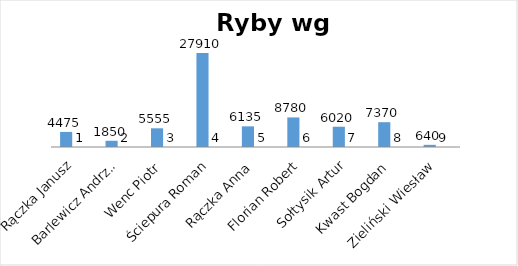
| Category | Series 0 | Series 1 |
|---|---|---|
| Rączka Janusz | 4475 | 1 |
| Barlewicz Andrzej | 1850 | 2 |
| Wenc Piotr | 5555 | 3 |
| Ściepura Roman | 27910 | 4 |
| Rączka Anna | 6135 | 5 |
| Florian Robert | 8780 | 6 |
| Sołtysik Artur | 6020 | 7 |
| Kwast Bogdan | 7370 | 8 |
| Zieliński Wiesław | 640 | 9 |